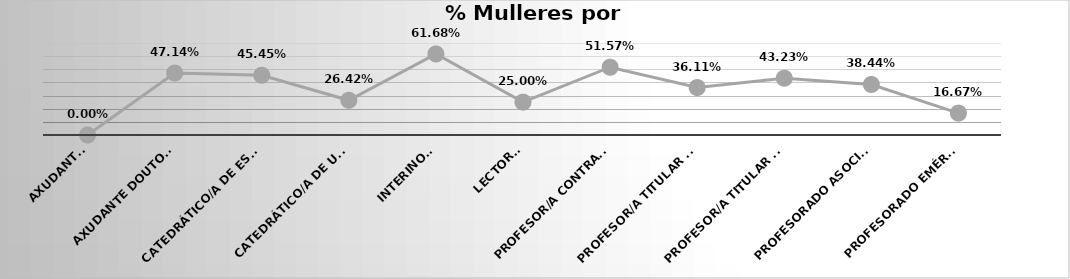
| Category | % Mulleres |
|---|---|
| Axudante   | 0 |
| Axudante doutor/a | 0.471 |
| Catedrático/a de Escola Universitaria | 0.455 |
| Catedrático/a de Universidade | 0.264 |
| Interino/a | 0.617 |
| Lector/a | 0.25 |
| Profesor/a contratado/a doutor/a | 0.516 |
| Profesor/a titular de Escola Universitaria | 0.361 |
| Profesor/a titular de Universidade | 0.432 |
| Profesorado asociado | 0.384 |
| Profesorado emérito | 0.167 |